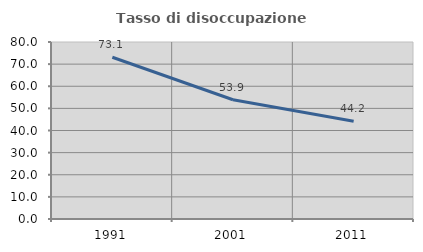
| Category | Tasso di disoccupazione giovanile  |
|---|---|
| 1991.0 | 73.095 |
| 2001.0 | 53.886 |
| 2011.0 | 44.172 |